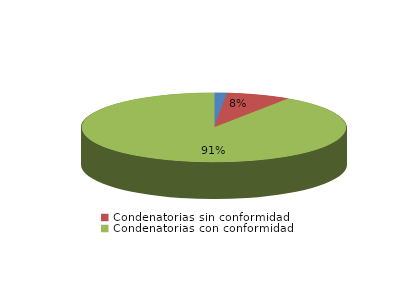
| Category | Series 0 |
|---|---|
| Absolutorias | 11 |
| Condenatorias sin conformidad | 55 |
| Condenatorias con conformidad | 643 |